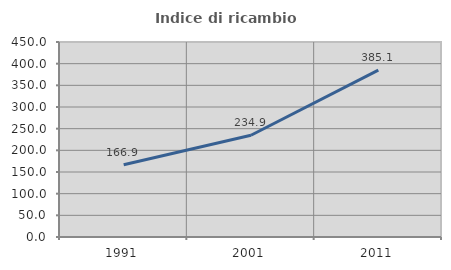
| Category | Indice di ricambio occupazionale  |
|---|---|
| 1991.0 | 166.923 |
| 2001.0 | 234.862 |
| 2011.0 | 385.135 |